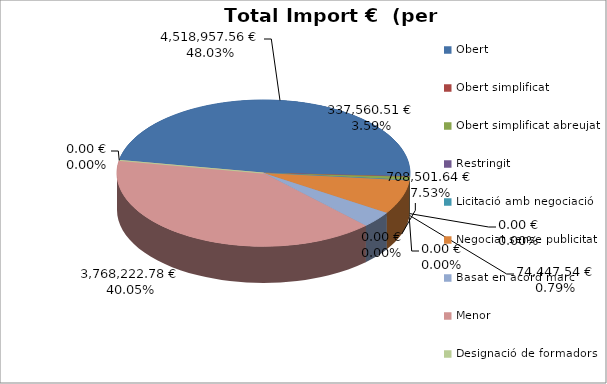
| Category | Total preu              (amb iva) |
|---|---|
| Obert | 4518957.558 |
| Obert simplificat | 0 |
| Obert simplificat abreujat | 74447.54 |
| Restringit | 0 |
| Licitació amb negociació | 0 |
| Negociat sense publicitat | 708501.635 |
| Basat en acord marc | 337560.51 |
| Menor | 3768222.776 |
| Designació de formadors | 0 |